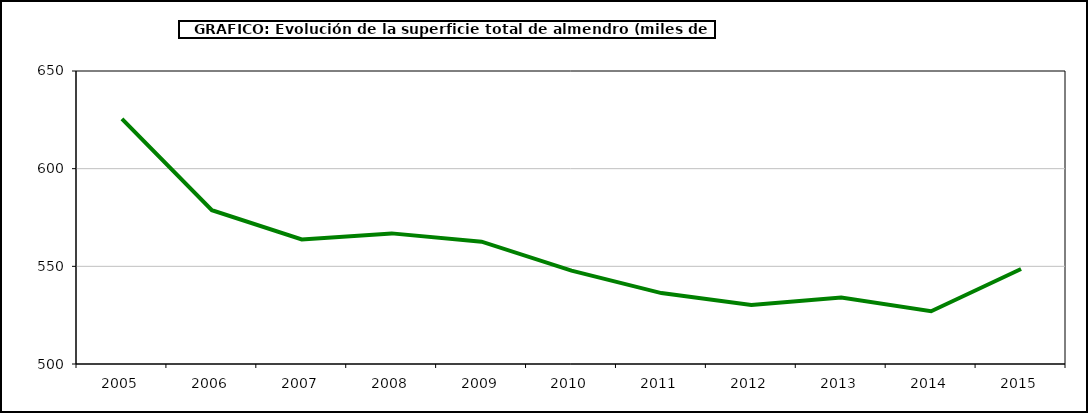
| Category | superficie almendro |
|---|---|
| 2005.0 | 625.483 |
| 2006.0 | 578.717 |
| 2007.0 | 563.77 |
| 2008.0 | 566.869 |
| 2009.0 | 562.616 |
| 2010.0 | 547.822 |
| 2011.0 | 536.312 |
| 2012.0 | 530.223 |
| 2013.0 | 534.057 |
| 2014.0 | 527.029 |
| 2015.0 | 548.604 |